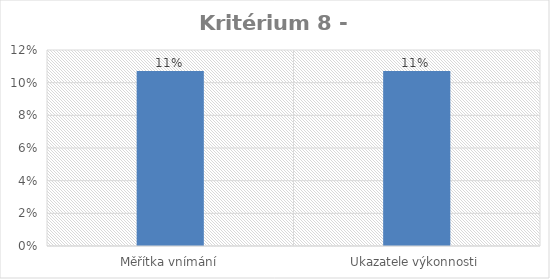
| Category | Series 0 |
|---|---|
| Měřítka vnímání | 0.107 |
| Ukazatele výkonnosti | 0.107 |